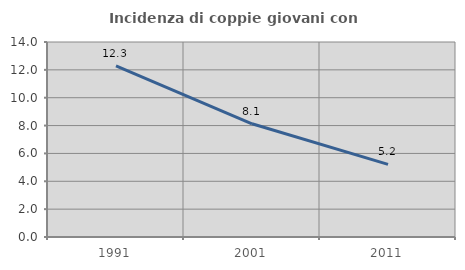
| Category | Incidenza di coppie giovani con figli |
|---|---|
| 1991.0 | 12.294 |
| 2001.0 | 8.127 |
| 2011.0 | 5.21 |